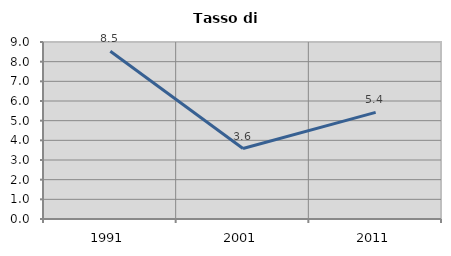
| Category | Tasso di disoccupazione   |
|---|---|
| 1991.0 | 8.531 |
| 2001.0 | 3.583 |
| 2011.0 | 5.422 |